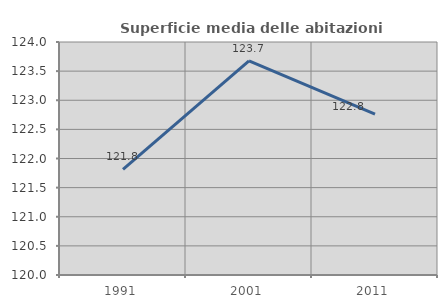
| Category | Superficie media delle abitazioni occupate |
|---|---|
| 1991.0 | 121.815 |
| 2001.0 | 123.675 |
| 2011.0 | 122.762 |